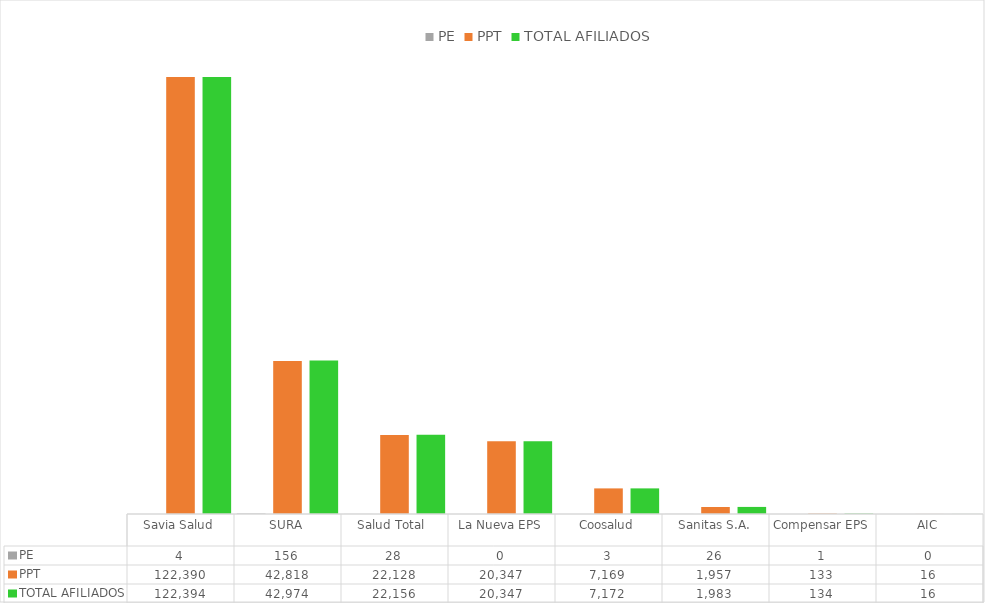
| Category | PE | PPT | TOTAL AFILIADOS |
|---|---|---|---|
| Savia Salud | 4 | 122390 | 122394 |
| SURA | 156 | 42818 | 42974 |
| Salud Total  | 28 | 22128 | 22156 |
| La Nueva EPS | 0 | 20347 | 20347 |
| Coosalud | 3 | 7169 | 7172 |
| Sanitas S.A. | 26 | 1957 | 1983 |
| Compensar EPS | 1 | 133 | 134 |
| AIC | 0 | 16 | 16 |